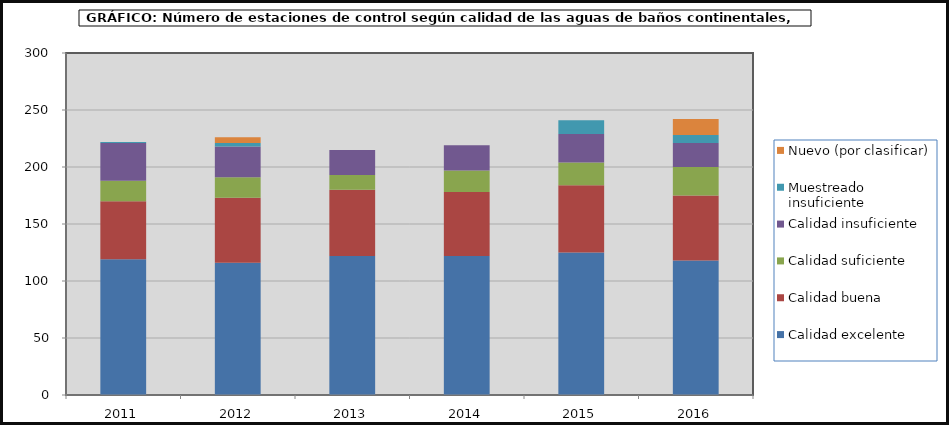
| Category | Calidad excelente | Calidad buena  | Calidad suficiente | Calidad insuficiente | Muestreado insuficiente | Nuevo (por clasificar) |
|---|---|---|---|---|---|---|
| 2011.0 | 119 | 51 | 18 | 33 | 1 | 0 |
| 2012.0 | 116 | 57 | 18 | 27 | 3 | 5 |
| 2013.0 | 122 | 58 | 13 | 22 | 0 | 0 |
| 2014.0 | 122 | 56 | 19 | 22 | 0 | 0 |
| 2015.0 | 125 | 59 | 20 | 25 | 12 | 0 |
| 2016.0 | 118 | 57 | 25 | 21 | 7 | 14 |